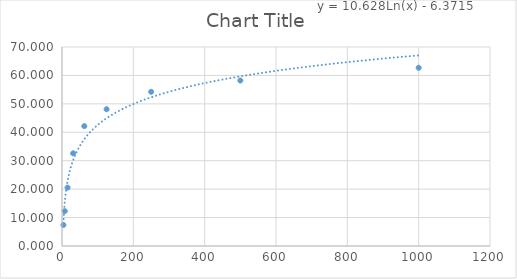
| Category | Series 0 |
|---|---|
| 3.91 | 7.387 |
| 7.81 | 12.252 |
| 15.62 | 20.541 |
| 31.25 | 32.613 |
| 62.5 | 42.162 |
| 125.0 | 48.108 |
| 250.0 | 54.234 |
| 500.0 | 58.198 |
| 1000.0 | 62.703 |